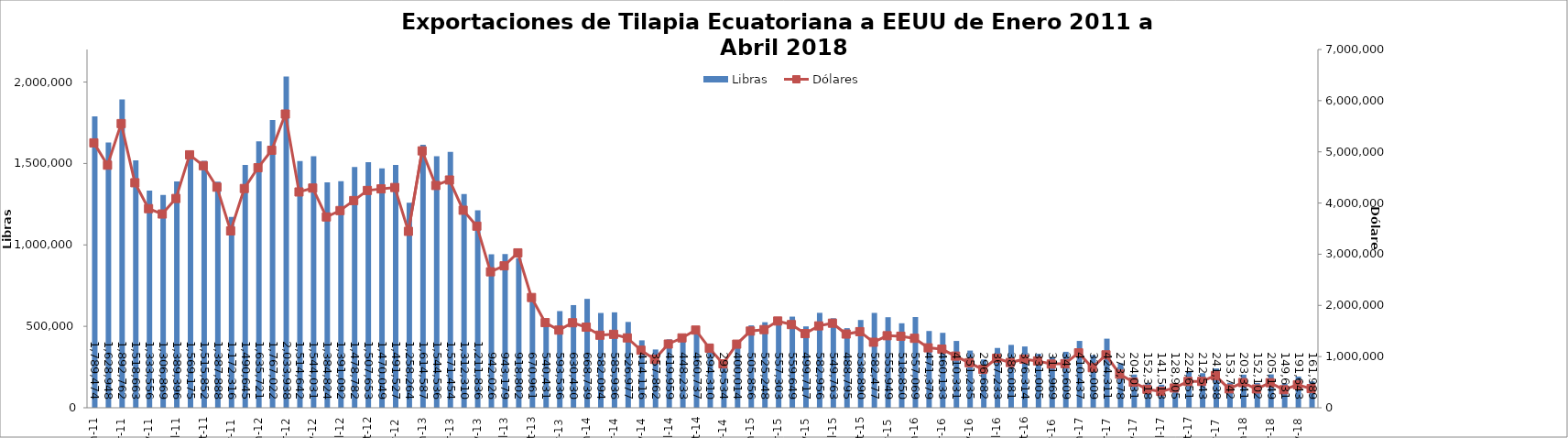
| Category | Libras  |
|---|---|
| 2011-01-01 | 1789473.82 |
| 2011-02-01 | 1628948.076 |
| 2011-03-01 | 1892761.535 |
| 2011-04-01 | 1518662.961 |
| 2011-05-01 | 1333555.926 |
| 2011-06-01 | 1306869.243 |
| 2011-07-01 | 1389396.24 |
| 2011-08-01 | 1569174.756 |
| 2011-09-01 | 1515852.096 |
| 2011-10-01 | 1387888.293 |
| 2011-11-01 | 1172315.891 |
| 2011-12-01 | 1490644.699 |
| 2012-01-01 | 1635720.607 |
| 2012-02-01 | 1767022.174 |
| 2012-03-01 | 2033937.505 |
| 2012-04-01 | 1514641.77 |
| 2012-05-01 | 1544031.293 |
| 2012-06-01 | 1384823.899 |
| 2012-07-01 | 1391091.577 |
| 2012-08-01 | 1478781.747 |
| 2012-09-01 | 1507653.188 |
| 2012-10-01 | 1470049.326 |
| 2012-11-01 | 1491526.539 |
| 2012-12-01 | 1258264 |
| 2013-01-01 | 1614587 |
| 2013-02-01 | 1544536.146 |
| 2013-03-01 | 1571454.312 |
| 2013-04-01 | 1312310.196 |
| 2013-05-01 | 1211835.551 |
| 2013-06-01 | 942025.58 |
| 2013-07-01 | 943178.586 |
| 2013-08-01 | 918802.324 |
| 2013-09-01 | 670961.192 |
| 2013-10-01 | 540431.235 |
| 2013-11-01 | 593535.64 |
| 2013-12-01 | 630429.621 |
| 2014-01-01 | 668739 |
| 2014-02-01 | 582093.766 |
| 2014-03-01 | 585936.383 |
| 2014-04-01 | 526976.561 |
| 2014-05-01 | 414116.473 |
| 2014-06-01 | 357861.695 |
| 2014-07-01 | 419958.663 |
| 2014-08-01 | 448233 |
| 2014-09-01 | 460737.149 |
| 2014-10-01 | 394310.347 |
| 2014-11-01 | 293533.672 |
| 2014-12-01 | 400013.647 |
| 2015-01-01 | 505856.493 |
| 2015-02-01 | 525248 |
| 2015-03-01 | 557303.039 |
| 2015-04-01 | 559648.733 |
| 2015-05-01 | 499716.682 |
| 2015-06-01 | 582955.764 |
| 2015-07-01 | 549763.307 |
| 2015-08-01 | 488795.094 |
| 2015-09-01 | 538890.219 |
| 2015-10-01 | 582477.366 |
| 2015-11-01 | 555949.414 |
| 2015-12-01 | 518850.405 |
| 2016-01-01 | 557069.351 |
| 2016-02-01 | 471378.754 |
| 2016-03-01 | 460133.089 |
| 2016-04-01 | 410331.175 |
| 2016-05-01 | 351235 |
| 2016-06-01 | 296682 |
| 2016-07-01 | 367233.45 |
| 2016-08-01 | 386080.575 |
| 2016-09-01 | 376314.197 |
| 2016-10-01 | 331005.258 |
| 2016-11-01 | 311968.537 |
| 2016-12-01 | 343608.956 |
| 2017-01-01 | 410436.996 |
| 2017-02-01 | 323009.174 |
| 2017-03-01 | 424310.544 |
| 2017-04-01 | 273577.632 |
| 2017-05-01 | 204031.321 |
| 2017-06-01 | 152318.019 |
| 2017-07-01 | 141513.274 |
| 2017-08-01 | 128905.167 |
| 2017-09-01 | 224650.945 |
| 2017-10-01 | 212543.281 |
| 2017-11-01 | 241337.562 |
| 2017-12-01 | 153742.19 |
| 2018-01-01 | 203341.281 |
| 2018-02-01 | 152101.968 |
| 2018-03-01 | 205149.053 |
| 2018-04-01 | 149630.611 |
| 2018-05-01 | 191643 |
| 2018-06-01 | 161989 |